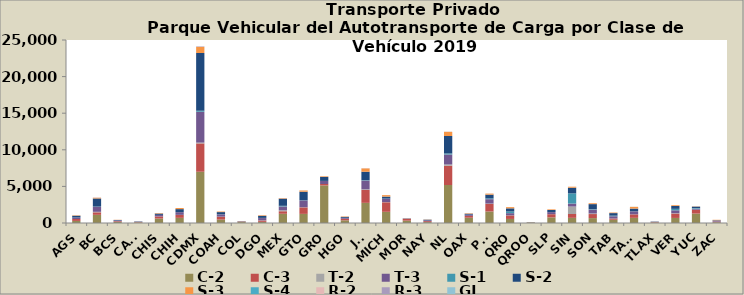
| Category | C-2 | C-3 | T-2 | T-3 | S-1 | S-2 | S-3 | S-4 | R-2 | R-3 | GI |
|---|---|---|---|---|---|---|---|---|---|---|---|
| AGS | 284 | 262 | 4 | 192 | 10 | 242 | 56 | 1 | 4 | 0 | 0 |
| BC | 1114 | 345 | 68 | 680 | 35 | 1110 | 97 | 3 | 39 | 5 | 1 |
| BCS | 159 | 91 | 2 | 93 | 1 | 62 | 27 | 0 | 1 | 7 | 1 |
| CAMP | 86 | 47 | 10 | 29 | 0 | 44 | 10 | 0 | 0 | 0 | 0 |
| CHIS | 607 | 280 | 4 | 210 | 10 | 180 | 66 | 0 | 5 | 0 | 0 |
| CHIH | 703 | 393 | 16 | 374 | 12 | 399 | 154 | 1 | 3 | 1 | 3 |
| CDMX | 7000 | 3873 | 109 | 4214 | 141 | 7886 | 823 | 7 | 81 | 16 | 21 |
| COAH | 468 | 388 | 14 | 309 | 16 | 294 | 79 | 1 | 2 | 1 | 0 |
| COL | 124 | 54 | 8 | 21 | 9 | 33 | 23 | 0 | 2 | 1 | 0 |
| DGO | 154 | 187 | 26 | 310 | 21 | 282 | 79 | 4 | 1 | 0 | 0 |
| MEX | 1259 | 349 | 129 | 524 | 86 | 981 | 68 | 0 | 20 | 3 | 3 |
| GTO | 1244 | 888 | 25 | 920 | 26 | 1169 | 174 | 2 | 1 | 0 | 9 |
| GRO | 5128 | 198 | 0 | 426 | 0 | 547 | 84 | 0 | 4 | 1 | 2 |
| HGO | 364 | 214 | 0 | 128 | 3 | 126 | 59 | 0 | 0 | 0 | 0 |
| JAL | 2751 | 1780 | 73 | 1205 | 54 | 1139 | 458 | 4 | 7 | 12 | 0 |
| MICH | 1527 | 1307 | 28 | 448 | 23 | 274 | 204 | 0 | 7 | 4 | 1 |
| MOR | 323 | 233 | 2 | 44 | 0 | 27 | 23 | 0 | 3 | 1 | 0 |
| NAY | 124 | 130 | 0 | 107 | 4 | 87 | 27 | 0 | 0 | 0 | 0 |
| NL | 5190 | 2636 | 165 | 1367 | 145 | 2381 | 569 | 3 | 12 | 10 | 6 |
| OAX | 721 | 256 | 1 | 168 | 0 | 122 | 60 | 0 | 1 | 4 | 0 |
| PUE | 1570 | 1046 | 37 | 600 | 111 | 507 | 144 | 0 | 9 | 5 | 0 |
| QRO | 554 | 479 | 14 | 299 | 228 | 428 | 166 | 1 | 2 | 0 | 4 |
| QROO | 71 | 12 | 1 | 15 | 1 | 8 | 2 | 0 | 1 | 0 | 0 |
| SLP | 769 | 435 | 9 | 275 | 7 | 280 | 87 | 0 | 6 | 4 | 1 |
| SIN | 704 | 528 | 1015 | 406 | 1394 | 774 | 138 | 1 | 1 | 0 | 1 |
| SON | 669 | 554 | 79 | 545 | 67 | 666 | 122 | 1 | 6 | 0 | 0 |
| TAB | 441 | 172 | 4 | 307 | 83 | 345 | 80 | 0 | 1 | 5 | 0 |
| TAMS | 705 | 472 | 6 | 421 | 22 | 344 | 237 | 6 | 2 | 3 | 0 |
| TLAX | 75 | 54 | 0 | 34 | 0 | 34 | 9 | 0 | 4 | 0 | 0 |
| VER | 692 | 599 | 47 | 395 | 200 | 386 | 114 | 0 | 5 | 0 | 0 |
| YUC | 1285 | 489 | 41 | 145 | 86 | 192 | 29 | 2 | 1 | 0 | 2 |
| ZAC | 105 | 85 | 6 | 107 | 2 | 66 | 67 | 0 | 0 | 1 | 0 |